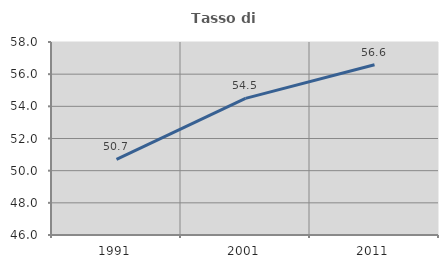
| Category | Tasso di occupazione   |
|---|---|
| 1991.0 | 50.697 |
| 2001.0 | 54.497 |
| 2011.0 | 56.586 |